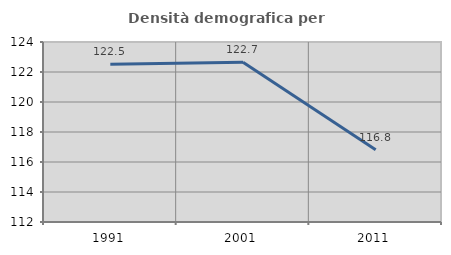
| Category | Densità demografica |
|---|---|
| 1991.0 | 122.523 |
| 2001.0 | 122.652 |
| 2011.0 | 116.821 |